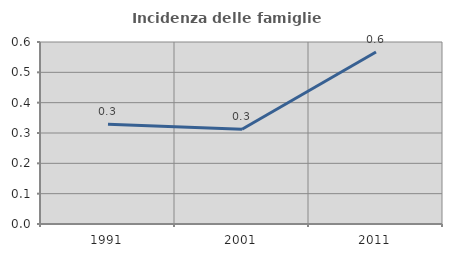
| Category | Incidenza delle famiglie numerose |
|---|---|
| 1991.0 | 0.329 |
| 2001.0 | 0.312 |
| 2011.0 | 0.567 |